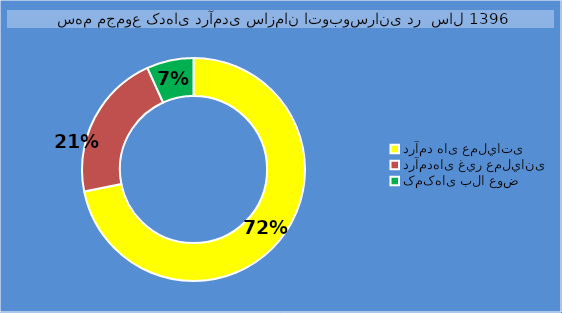
| Category | Series 0 |
|---|---|
| درآمد های عملياتی  | 27570800 |
| درآمدهای غير عمليانی  | 8212975 |
| کمکهای بلا عوض | 2601267 |